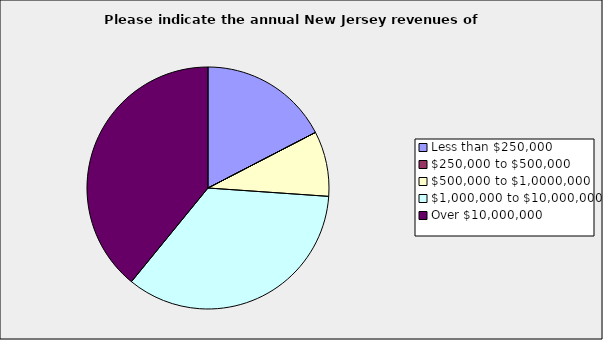
| Category | Series 0 |
|---|---|
| Less than $250,000 | 0.174 |
| $250,000 to $500,000 | 0 |
| $500,000 to $1,0000,000 | 0.087 |
| $1,000,000 to $10,000,000 | 0.348 |
| Over $10,000,000 | 0.391 |